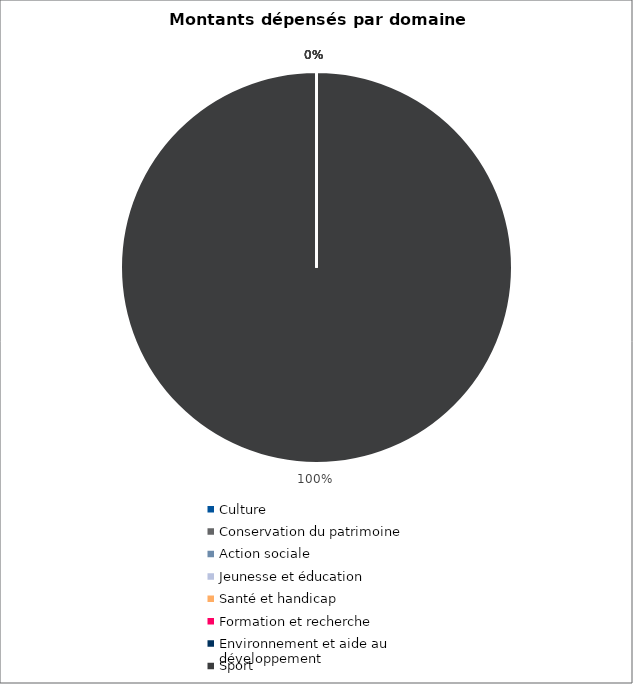
| Category | Series 0 |
|---|---|
| Culture | 0 |
| Conservation du patrimoine | 0 |
| Action sociale | 0 |
| Jeunesse et éducation | 0 |
| Santé et handicap | 0 |
| Formation et recherche | 0 |
| Environnement et aide au
développement | 0 |
| Sport | 5788358 |
| Autres projets d’utilité publique | 0 |